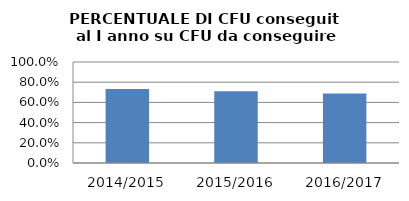
| Category | 2014/2015 2015/2016 2016/2017 |
|---|---|
| 2014/2015 | 0.732 |
| 2015/2016 | 0.711 |
| 2016/2017 | 0.688 |